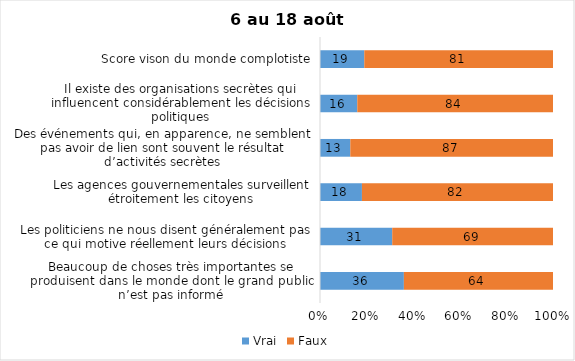
| Category | Vrai | Faux |
|---|---|---|
| Beaucoup de choses très importantes se produisent dans le monde dont le grand public n’est pas informé | 36 | 64 |
| Les politiciens ne nous disent généralement pas ce qui motive réellement leurs décisions | 31 | 69 |
| Les agences gouvernementales surveillent étroitement les citoyens | 18 | 82 |
| Des événements qui, en apparence, ne semblent pas avoir de lien sont souvent le résultat d’activités secrètes | 13 | 87 |
| Il existe des organisations secrètes qui influencent considérablement les décisions politiques | 16 | 84 |
| Score vison du monde complotiste | 19 | 81 |